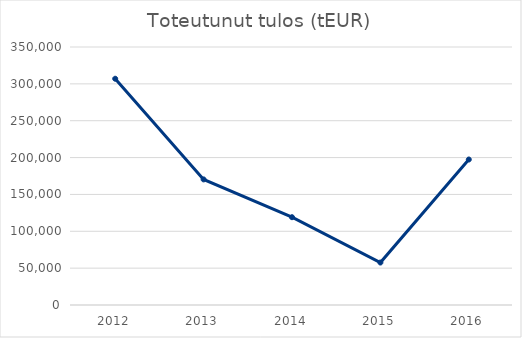
| Category | TOTEUTUNUT TULOS |
|---|---|
| 2012.0 | 306947.957 |
| 2013.0 | 170390.767 |
| 2014.0 | 119102.876 |
| 2015.0 | 57586.557 |
| 2016.0 | 197384.187 |